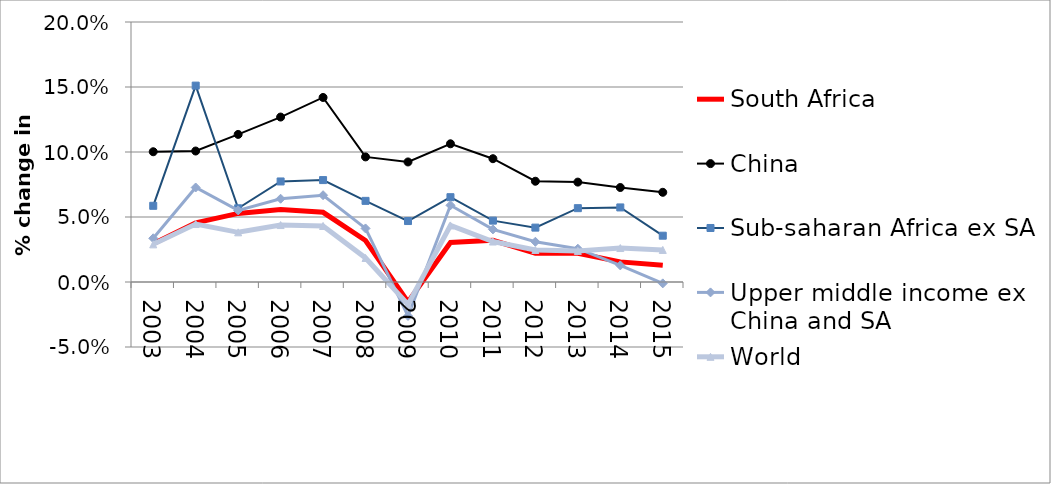
| Category | South Africa | China | Sub-saharan Africa ex SA | Upper middle income ex China and SA | World |
|---|---|---|---|---|---|
| 2003.0 | 0.029 | 0.1 | 0.059 | 0.034 | 0.029 |
| 2004.0 | 0.046 | 0.101 | 0.151 | 0.073 | 0.045 |
| 2005.0 | 0.053 | 0.114 | 0.057 | 0.055 | 0.038 |
| 2006.0 | 0.056 | 0.127 | 0.077 | 0.064 | 0.044 |
| 2007.0 | 0.054 | 0.142 | 0.078 | 0.067 | 0.043 |
| 2008.0 | 0.032 | 0.096 | 0.062 | 0.041 | 0.018 |
| 2009.0 | -0.015 | 0.092 | 0.047 | -0.026 | -0.017 |
| 2010.0 | 0.03 | 0.106 | 0.065 | 0.059 | 0.044 |
| 2011.0 | 0.032 | 0.095 | 0.047 | 0.04 | 0.031 |
| 2012.0 | 0.022 | 0.078 | 0.042 | 0.031 | 0.025 |
| 2013.0 | 0.022 | 0.077 | 0.057 | 0.026 | 0.024 |
| 2014.0 | 0.015 | 0.073 | 0.057 | 0.013 | 0.026 |
| 2015.0 | 0.013 | 0.069 | 0.036 | -0.001 | 0.025 |